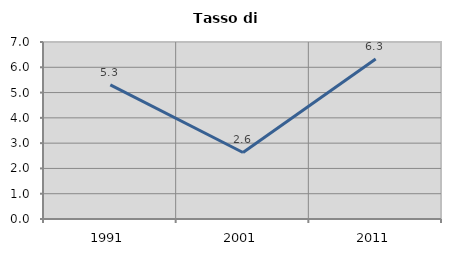
| Category | Tasso di disoccupazione   |
|---|---|
| 1991.0 | 5.306 |
| 2001.0 | 2.631 |
| 2011.0 | 6.33 |